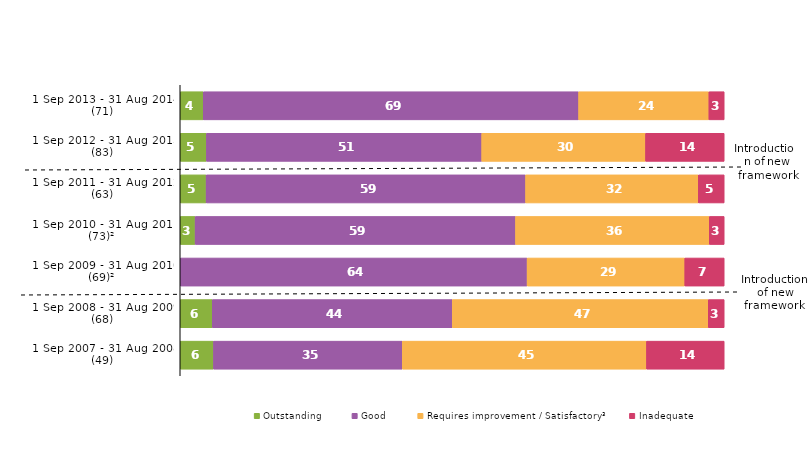
| Category | Outstanding | Good | Requires improvement / Satisfactory³ | Inadequate |
|---|---|---|---|---|
| 1 Sep 2013 - 31 Aug 2014 (71) | 4.225 | 69.014 | 23.944 | 2.817 |
| 1 Sep 2012 - 31 Aug 2013 (83) | 4.819 | 50.602 | 30.12 | 14.458 |
| 1 Sep 2011 - 31 Aug 2012 (63) | 4.762 | 58.73 | 31.746 | 4.762 |
| 1 Sep 2010 - 31 Aug 2011 (73)² | 2.74 | 58.904 | 35.616 | 2.74 |
| 1 Sep 2009 - 31 Aug 2010 (69)² | 0 | 63.768 | 28.986 | 7.246 |
| 1 Sep 2008 - 31 Aug 2009 (68) | 5.882 | 44.118 | 47.059 | 2.941 |
| 1 Sep 2007 - 31 Aug 2008 (49) | 6.122 | 34.694 | 44.898 | 14.286 |